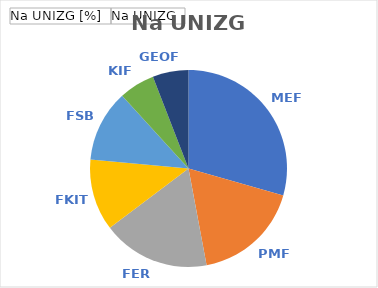
| Category | Na UNIZG [%] | Na UNIZG |
|---|---|---|
| MEF | 0.294 | 5 |
| PMF | 0.176 | 3 |
| FER | 0.176 | 3 |
| FKIT | 0.118 | 2 |
| FSB | 0.118 | 2 |
| KIF | 0.059 | 1 |
| GEOF | 0.059 | 1 |